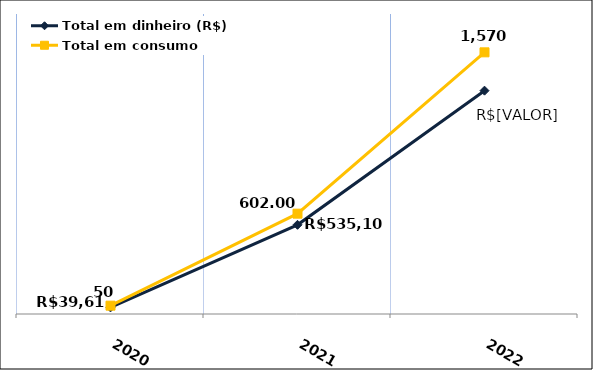
| Category | Total em dinheiro (R$) |
|---|---|
| 2020.0 | 39.61 |
| 2021.0 | 535.1 |
| 2022.0 | 1339.97 |